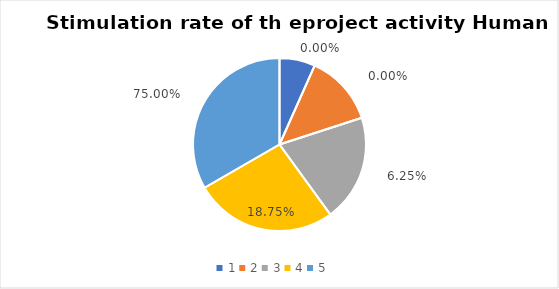
| Category | Series 0 | Series 1 |
|---|---|---|
| 0 | 1 | 0 |
| 1 | 2 | 0 |
| 2 | 3 | 0.062 |
| 3 | 4 | 0.188 |
| 4 | 5 | 0.75 |